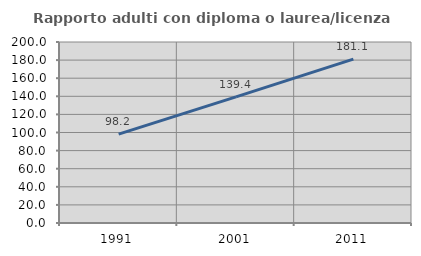
| Category | Rapporto adulti con diploma o laurea/licenza media  |
|---|---|
| 1991.0 | 98.155 |
| 2001.0 | 139.404 |
| 2011.0 | 181.139 |